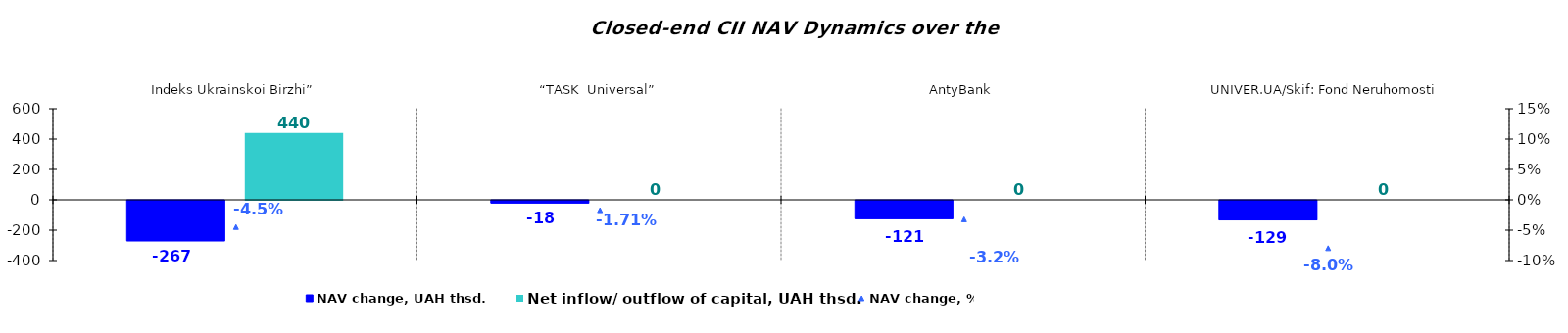
| Category | NAV change, UAH thsd. | Net inflow/ outflow of capital, UAH thsd. |
|---|---|---|
| Indeks Ukrainskoi Birzhi” | -266.934 | 440.069 |
| “TASK  Universal” | -17.596 | 0 |
| AntyBank | -121.007 | 0 |
| UNIVER.UA/Skif: Fond Neruhomosti | -129.397 | 0 |